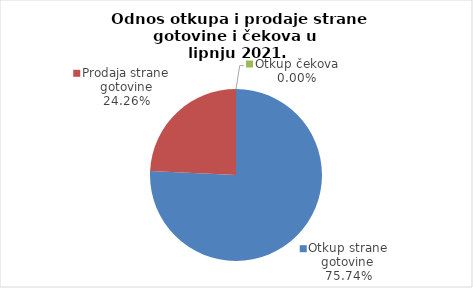
| Category | Series 0 |
|---|---|
| Otkup strane gotovine | 75.743 |
| Prodaja strane gotovine | 24.257 |
| Otkup čekova | 0 |